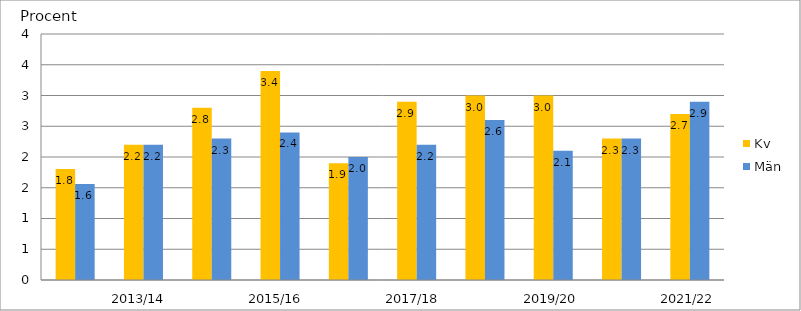
| Category | Kv | Män |
|---|---|---|
|  | 1.807 | 1.563 |
| 2013/14  | 2.2 | 2.2 |
|  | 2.8 | 2.3 |
| 2015/16  | 3.4 | 2.4 |
|  | 1.9 | 2 |
| 2017/18  | 2.9 | 2.2 |
|  | 3 | 2.6 |
| 2019/20 | 3 | 2.1 |
|  | 2.3 | 2.3 |
| 2021/22 | 2.7 | 2.9 |